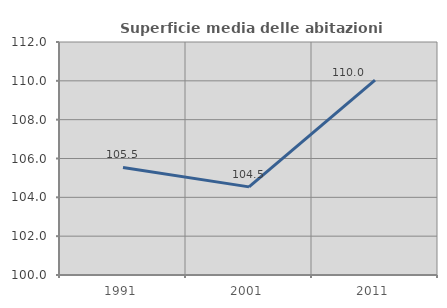
| Category | Superficie media delle abitazioni occupate |
|---|---|
| 1991.0 | 105.538 |
| 2001.0 | 104.538 |
| 2011.0 | 110.038 |